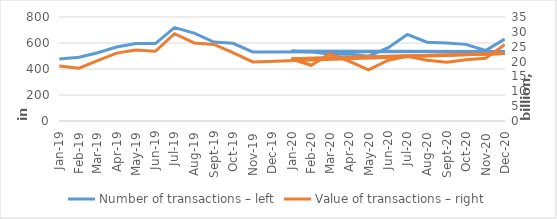
| Category | Number of transactions – left |
|---|---|
| 2019-01-01 | 476280 |
| 2019-02-01 | 490220 |
| 2019-03-01 | 523506 |
| 2019-04-01 | 569607 |
| 2019-05-01 | 596357 |
| 2019-06-01 | 595773 |
| 2019-07-01 | 718880 |
| 2019-08-01 | 676521 |
| 2019-09-01 | 606974 |
| 2019-10-01 | 597555 |
| 2019-11-01 | 531100 |
| 2020-12-01 | 535262 |
| 2020-01-01 | 536477 |
| 2020-02-01 | 531850 |
| 2020-03-01 | 513951 |
| 2020-04-01 | 514502 |
| 2020-05-01 | 498228 |
| 2020-06-01 | 564271 |
| 2020-07-01 | 665655 |
| 2020-08-01 | 605764 |
| 2020-09-01 | 600772 |
| 2020-10-01 | 589410 |
| 2020-11-01 | 542127 |
| 2020-12-01 | 629802 |